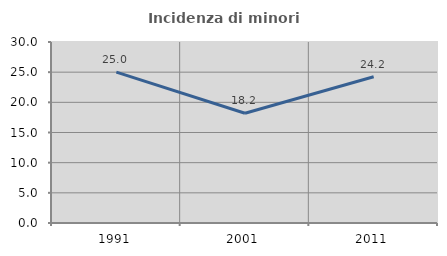
| Category | Incidenza di minori stranieri |
|---|---|
| 1991.0 | 25 |
| 2001.0 | 18.182 |
| 2011.0 | 24.242 |